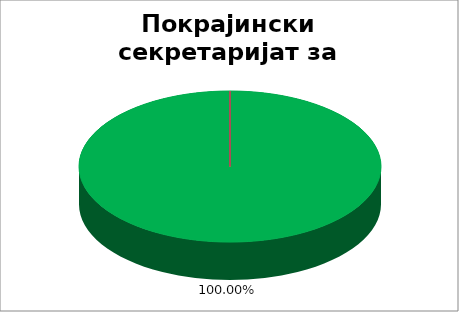
| Category | Покрајински секретаријат за финансије |
|---|---|
| 0 | 1 |
| 1 | 0 |
| 2 | 0 |
| 3 | 0 |
| 4 | 0 |